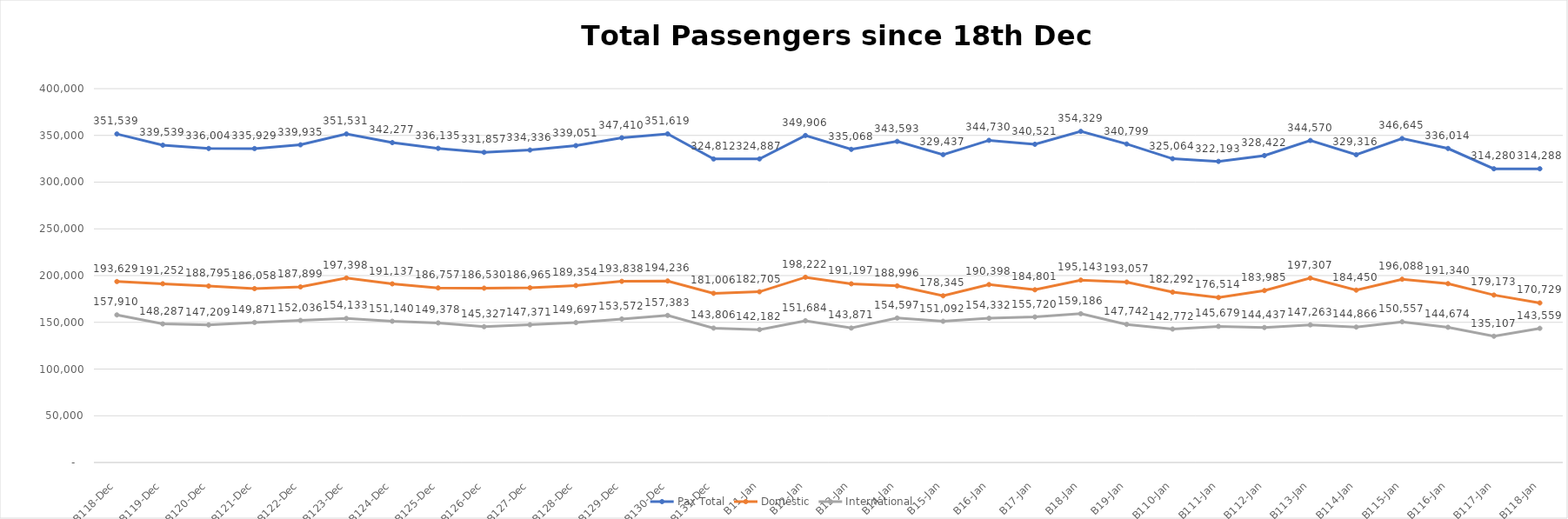
| Category | Pax Total |  Domestic  |  International  |
|---|---|---|---|
| 2022-12-18 | 351539 | 193629 | 157910 |
| 2022-12-19 | 339539 | 191252 | 148287 |
| 2022-12-20 | 336004 | 188795 | 147209 |
| 2022-12-21 | 335929 | 186058 | 149871 |
| 2022-12-22 | 339935 | 187899 | 152036 |
| 2022-12-23 | 351531 | 197398 | 154133 |
| 2022-12-24 | 342277 | 191137 | 151140 |
| 2022-12-25 | 336135 | 186757 | 149378 |
| 2022-12-26 | 331857 | 186530 | 145327 |
| 2022-12-27 | 334336 | 186965 | 147371 |
| 2022-12-28 | 339051 | 189354 | 149697 |
| 2022-12-29 | 347410 | 193838 | 153572 |
| 2022-12-30 | 351619 | 194236 | 157383 |
| 2022-12-31 | 324812 | 181006 | 143806 |
| 2023-01-01 | 324887 | 182705 | 142182 |
| 2023-01-02 | 349906 | 198222 | 151684 |
| 2023-01-03 | 335068 | 191197 | 143871 |
| 2023-01-04 | 343593 | 188996 | 154597 |
| 2023-01-05 | 329437 | 178345 | 151092 |
| 2023-01-06 | 344730 | 190398 | 154332 |
| 2023-01-07 | 340521 | 184801 | 155720 |
| 2023-01-08 | 354329 | 195143 | 159186 |
| 2023-01-09 | 340799 | 193057 | 147742 |
| 2023-01-10 | 325064 | 182292 | 142772 |
| 2023-01-11 | 322193 | 176514 | 145679 |
| 2023-01-12 | 328422 | 183985 | 144437 |
| 2023-01-13 | 344570 | 197307 | 147263 |
| 2023-01-14 | 329316 | 184450 | 144866 |
| 2023-01-15 | 346645 | 196088 | 150557 |
| 2023-01-16 | 336014 | 191340 | 144674 |
| 2023-01-17 | 314280 | 179173 | 135107 |
| 2023-01-18 | 314288 | 170729 | 143559 |